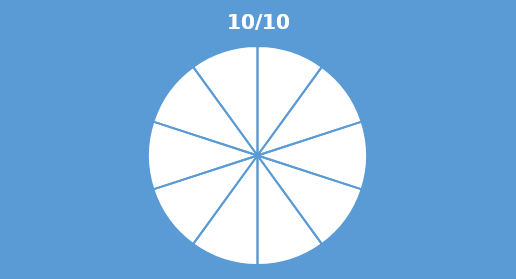
| Category | Series 0 |
|---|---|
| 0 | 0.1 |
| 1 | 0.1 |
| 2 | 0.1 |
| 3 | 0.1 |
| 4 | 0.1 |
| 5 | 0.1 |
| 6 | 0.1 |
| 7 | 0.1 |
| 8 | 0.1 |
| 9 | 0.1 |